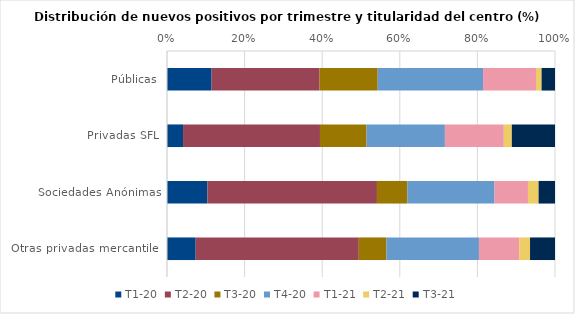
| Category | T1-20 | T2-20 | T3-20 | T4-20 | T1-21 | T2-21 | T3-21 |
|---|---|---|---|---|---|---|---|
| Públicas | 11.495 | 27.826 | 14.986 | 27.153 | 13.641 | 1.441 | 3.458 |
| Privadas SFL | 4.134 | 35.294 | 12.003 | 20.191 | 15.183 | 2.067 | 11.129 |
| Sociedades Anónimas | 10.415 | 43.696 | 7.831 | 22.475 | 8.614 | 2.741 | 4.229 |
| Otras privadas mercantiles | 7.392 | 42.038 | 7.098 | 23.869 | 10.371 | 2.795 | 6.436 |